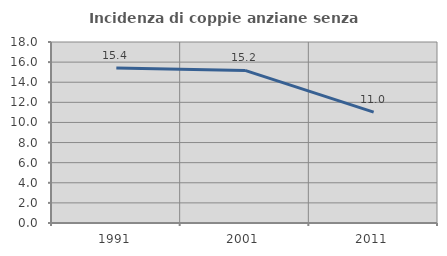
| Category | Incidenza di coppie anziane senza figli  |
|---|---|
| 1991.0 | 15.424 |
| 2001.0 | 15.176 |
| 2011.0 | 11.019 |